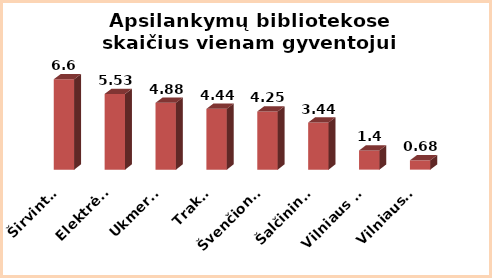
| Category | Series 0 |
|---|---|
|  Širvintos | 6.6 |
|  Elektrėnai | 5.53 |
|  Ukmergė | 4.88 |
|  Trakai | 4.44 |
|  Švenčionys | 4.25 |
|  Šalčininkai | 3.44 |
| Vilniaus m. | 1.4 |
|  Vilniaus r. | 0.68 |